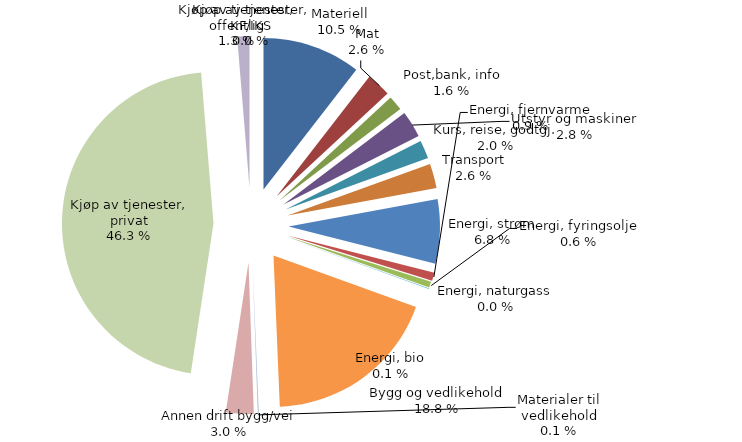
| Category | Series 0 |
|---|---|
| Materiell | 7814.026 |
| Mat | 1942.159 |
| Post,bank, info | 1189.858 |
| Utstyr og maskiner | 2112.239 |
| Kurs, reise, godtgj. | 1459.296 |
| Transport | 1949.729 |
| Energi, strøm | 5091.764 |
| Energi, fjernvarme | 657.579 |
| Energi, fyringsolje | 468.638 |
| Energi, naturgass | 0 |
| Energi, bio | 42.769 |
| Bygg og vedlikehold | 14023.21 |
| Materialer til vedlikehold | 77.728 |
| Annen drift bygg/vei | 2202.558 |
| Kjøp av tjenester, privat | 34490.28 |
| Kjøp av tjenester, offentlig | 970.99 |
| Kjøp av tjenester, KF/IKS | 0 |